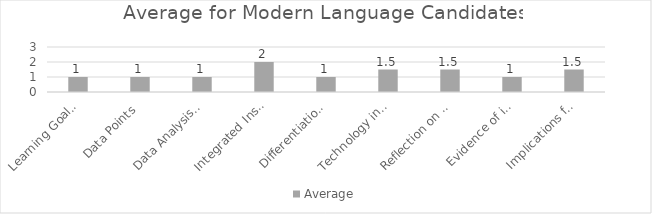
| Category | Average |
|---|---|
| Learning Goals Aligned with Pre-/Post-assessments ACEI 4.0 | 1 |
| Data Points | 1 |
| Data Analysis for Pedagogical Decisions ACEI 4.0 | 1 |
| Integrated Instruction ACEI 3.1 | 2 |
| Differentiation based on knowledge of individual learning ACEI 3.2 | 1 |
| Technology integration | 1.5 |
| Reflection on pedagogical decisions ACEI 1.0 | 1.5 |
| Evidence of impact on student learning ACEI 5.1 | 1 |
| Implications for teaching and professional development ACEI 5.1 | 1.5 |